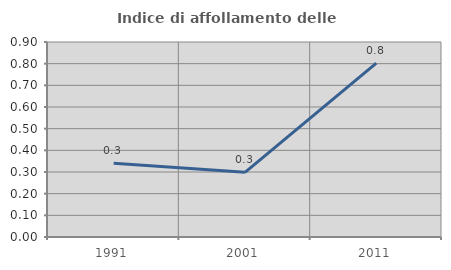
| Category | Indice di affollamento delle abitazioni  |
|---|---|
| 1991.0 | 0.34 |
| 2001.0 | 0.299 |
| 2011.0 | 0.802 |